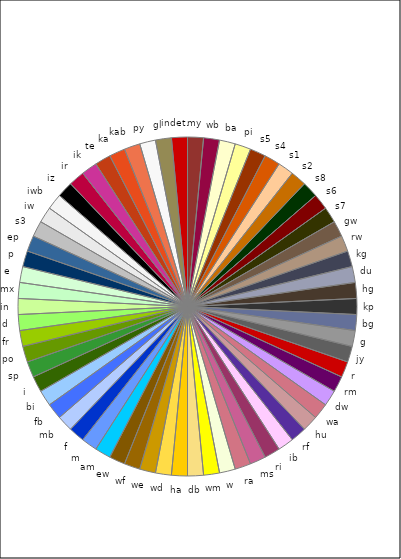
| Category | Series 0 |
|---|---|
| my | 1 |
| wb | 1 |
| ba | 1 |
| pi | 1 |
| s5 | 1 |
| s4 | 1 |
| s1 | 1 |
| s2 | 1 |
| s8 | 1 |
| s6 | 1 |
| s7 | 1 |
| gw | 1 |
| rw | 1 |
| kg | 1 |
| du | 1 |
| hg | 1 |
| kp | 1 |
| bg | 1 |
| g | 1 |
| jy | 1 |
| r | 1 |
| rm | 1 |
| dw | 1 |
| wa | 1 |
| hu | 1 |
| rf | 1 |
| ib | 1 |
| ri | 1 |
| ms | 1 |
| ra | 1 |
| w | 1 |
| wm | 1 |
| db | 1 |
| ha | 1 |
| wd | 1 |
| we | 1 |
| wf | 1 |
| ew | 1 |
| am | 1 |
| m | 1 |
| f | 1 |
| mb | 1 |
| fb | 1 |
| bi | 1 |
| i | 1 |
| sp | 1 |
| po | 1 |
| fr | 1 |
| d | 1 |
| in | 1 |
| mx | 1 |
| e | 1 |
| p | 1 |
| ep | 1 |
| s3 | 1 |
| iw | 1 |
| iwb | 1 |
| iz | 1 |
| ir | 1 |
| ik | 1 |
| te | 1 |
| ka | 1 |
| kab | 1 |
| py | 1 |
| gl | 1 |
| indet. | 1 |